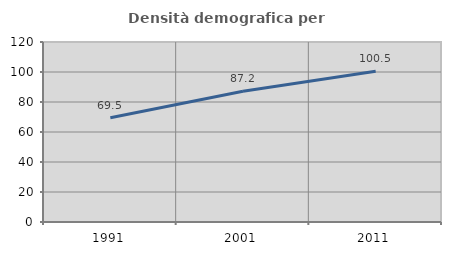
| Category | Densità demografica |
|---|---|
| 1991.0 | 69.545 |
| 2001.0 | 87.156 |
| 2011.0 | 100.464 |